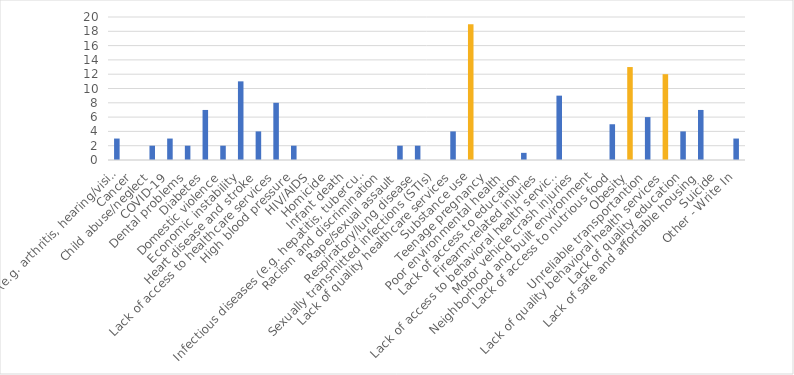
| Category | Number of Responses |
|---|---|
| Aging problems (e.g. arthritis, hearing/vision loss, etc.) | 3 |
| Cancer | 0 |
| Child abuse/neglect | 2 |
| COVID-19 | 3 |
| Dental problems | 2 |
| Diabetes | 7 |
| Domestic violence | 2 |
| Economic instability | 11 |
| Heart disease and stroke | 4 |
| Lack of access to healthcare services | 8 |
| High blood pressure | 2 |
| HIV/AIDS | 0 |
| Homicide | 0 |
| Infant death | 0 |
| Infectious diseases (e.g. hepatitis, tuberculosis, etc.) | 0 |
| Racism and discrimination | 0 |
| Rape/sexual assault | 2 |
| Respiratory/lung disease | 2 |
| Sexually transmitted infections (STIs) | 0 |
| Lack of quality healthcare services | 4 |
| Substance use | 19 |
| Teenage pregnancy | 0 |
| Poor environmental health | 0 |
| Lack of access to education | 1 |
| Firearm-related injuries | 0 |
| Lack of access to behavioral health services | 9 |
| Motor vehicle crash injuries | 0 |
| Neighborhood and built environment | 0 |
| Lack of access to nutrious food | 5 |
| Obesity | 13 |
| Unreliable transportantion | 6 |
| Lack of quality behavioral health services | 12 |
| Lack of quality education | 4 |
| Lack of safe and affortable housing | 7 |
| Suicide | 0 |
| Other - Write In | 3 |